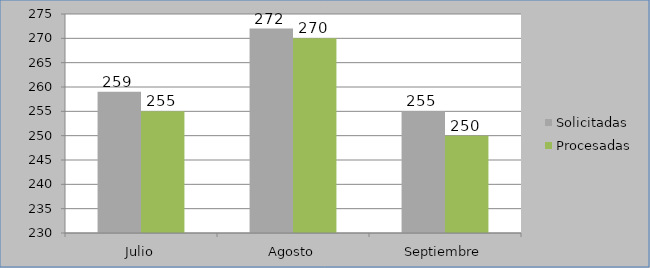
| Category | Solicitadas | Procesadas |
|---|---|---|
| Julio | 259 | 255 |
| Agosto | 272 | 270 |
| Septiembre | 255 | 250 |